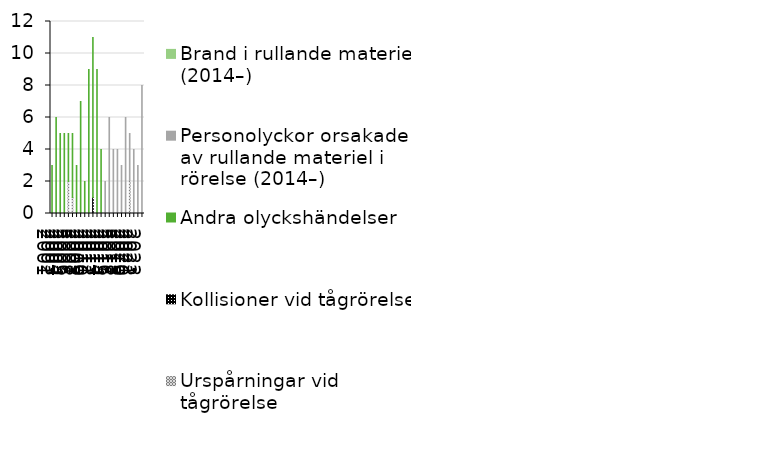
| Category | Urspårningar vid tågrörelse | Kollisioner vid tågrörelse | Andra olyckshändelser | Personolyckor orsakade av rullande materiel i rörelse (2014–) | Brand i rullande materiel (2014–) |
|---|---|---|---|---|---|
| 2001 | 0 | 0 | 3 | 0 | 0 |
| 2002 | 0 | 0 | 6 | 0 | 0 |
| 2003 | 0 | 0 | 5 | 0 | 0 |
| 2004 | 0 | 0 | 5 | 0 | 0 |
| 2005 | 2 | 0 | 3 | 0 | 0 |
| 2006 | 1 | 0 | 4 | 0 | 0 |
| 2007 | 0 | 0 | 3 | 0 | 0 |
| 2008 | 0 | 0 | 7 | 0 | 0 |
| 2009 | 0 | 0 | 2 | 0 | 0 |
| 2010 | 0 | 0 | 9 | 0 | 0 |
| 2011 | 0 | 1 | 10 | 0 | 0 |
| 2012 | 0 | 0 | 9 | 0 | 0 |
| 2013 | 0 | 0 | 4 | 0 | 0 |
| 2014 | 0 | 0 | 0 | 2 | 0 |
| 2015 | 0 | 0 | 0 | 6 | 0 |
| 2016 | 0 | 0 | 0 | 4 | 0 |
| 2017 | 0 | 0 | 0 | 4 | 0 |
| 2018 | 0 | 0 | 0 | 3 | 0 |
| 2019 | 0 | 0 | 0 | 6 | 0 |
| 2020 | 2 | 0 | 0 | 3 | 0 |
| 2021 | 0 | 0 | 0 | 4 | 0 |
| 2022 | 0 | 0 | 0 | 3 | 0 |
| 2023 | 0 | 0 | 0 | 8 | 0 |